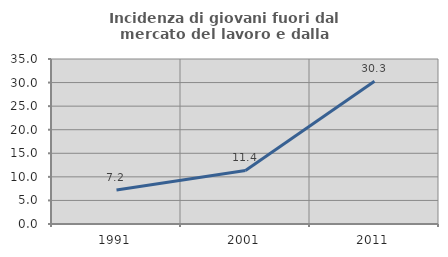
| Category | Incidenza di giovani fuori dal mercato del lavoro e dalla formazione  |
|---|---|
| 1991.0 | 7.19 |
| 2001.0 | 11.364 |
| 2011.0 | 30.303 |